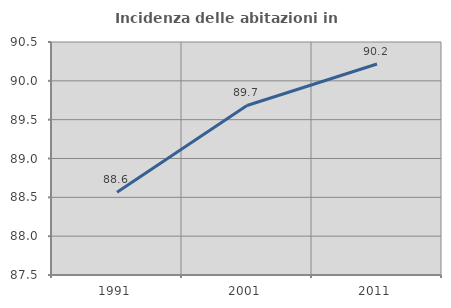
| Category | Incidenza delle abitazioni in proprietà  |
|---|---|
| 1991.0 | 88.567 |
| 2001.0 | 89.683 |
| 2011.0 | 90.217 |